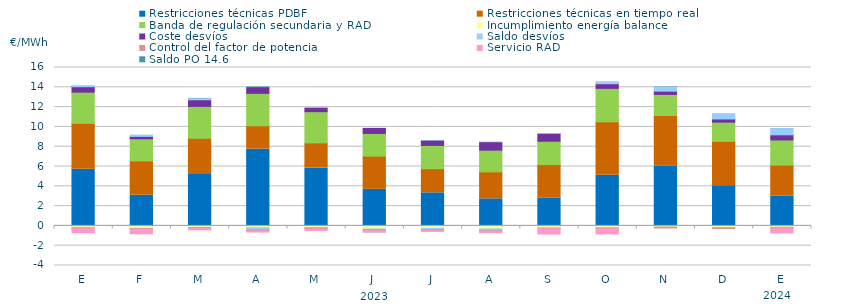
| Category | Restricciones técnicas PDBF | Restricciones técnicas en tiempo real | Banda de regulación secundaria y RAD | Incumplimiento energía balance | Coste desvíos | Saldo desvíos | Control del factor de potencia | Servicio RAD | Saldo PO 14.6 |
|---|---|---|---|---|---|---|---|---|---|
| E | 5.72 | 4.64 | 3.15 | -0.18 | 0.55 | 0.02 | -0.08 | -0.53 | 0.04 |
| F | 3.1 | 3.46 | 2.24 | -0.25 | 0.24 | 0.11 | -0.08 | -0.57 | 0.01 |
| M | 5.2 | 3.65 | 3.22 | -0.17 | 0.67 | 0.09 | -0.09 | -0.24 | 0.05 |
| A | 7.75 | 2.36 | 3.28 | -0.18 | 0.58 | -0.23 | -0.09 | -0.22 | 0.06 |
| M | 5.83 | 2.55 | 3.16 | -0.18 | 0.33 | -0.04 | -0.09 | -0.25 | 0.05 |
| J | 3.69 | 3.36 | 2.29 | -0.31 | 0.51 | -0.08 | -0.09 | -0.24 | -0.02 |
| J | 3.34 | 2.44 | 2.35 | -0.25 | 0.44 | -0.14 | -0.07 | -0.2 | 0.04 |
| A | 2.73 | 2.73 | 2.19 | -0.3 | 0.76 | -0.19 | -0.08 | -0.22 | 0.04 |
| S | 2.79 | 3.4 | 2.36 | -0.21 | 0.7 | 0 | -0.07 | -0.64 | 0.05 |
| O | 5.11 | 5.4 | 3.38 | -0.19 | 0.47 | 0.11 | -0.09 | -0.63 | 0.05 |
| N | 6.06 | 5.09 | 2.13 | -0.12 | 0.33 | 0.39 | -0.09 | 0 | 0.04 |
| D | 4.06 | 4.48 | 1.94 | -0.18 | 0.32 | 0.46 | -0.09 | 0 | 0.04 |
| E | 3.01 | 3.13 | 2.54 | -0.15 | 0.52 | 0.62 | -0.09 | -0.58 | 0.02 |